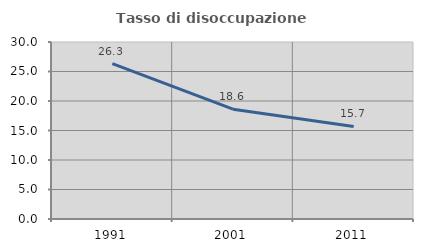
| Category | Tasso di disoccupazione giovanile  |
|---|---|
| 1991.0 | 26.323 |
| 2001.0 | 18.611 |
| 2011.0 | 15.68 |